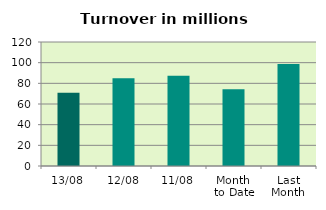
| Category | Series 0 |
|---|---|
| 13/08 | 70.989 |
| 12/08 | 84.891 |
| 11/08 | 87.349 |
| Month 
to Date | 74.328 |
| Last
Month | 98.668 |